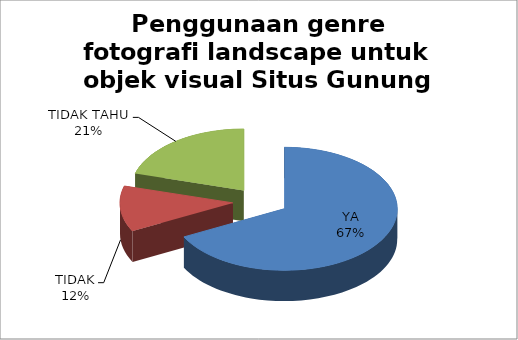
| Category | Penggunaan genre fotografi landscape untuk objek visual Situs Gunung Padang  |
|---|---|
| YA | 118 |
| TIDAK | 21 |
| TIDAK TAHU | 36 |